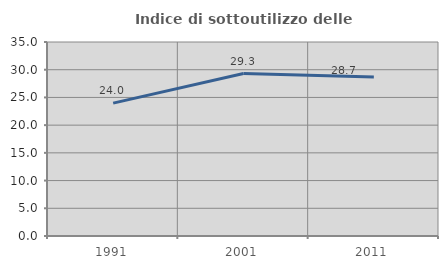
| Category | Indice di sottoutilizzo delle abitazioni  |
|---|---|
| 1991.0 | 23.97 |
| 2001.0 | 29.31 |
| 2011.0 | 28.685 |